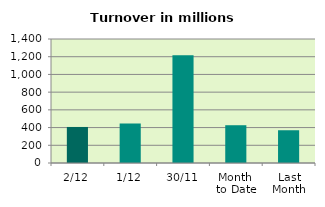
| Category | Series 0 |
|---|---|
| 2/12 | 406.886 |
| 1/12 | 446.044 |
| 30/11 | 1215.309 |
| Month 
to Date | 426.465 |
| Last
Month | 369.747 |